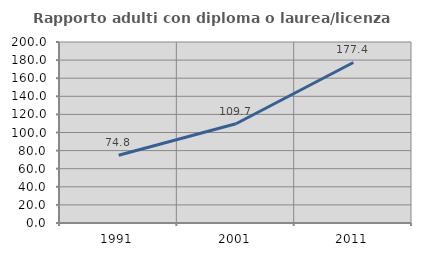
| Category | Rapporto adulti con diploma o laurea/licenza media  |
|---|---|
| 1991.0 | 74.834 |
| 2001.0 | 109.684 |
| 2011.0 | 177.352 |